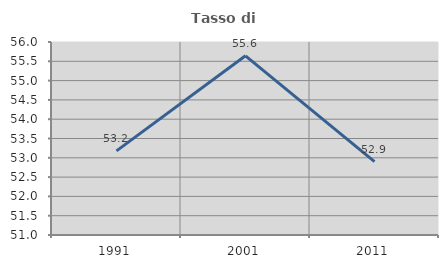
| Category | Tasso di occupazione   |
|---|---|
| 1991.0 | 53.179 |
| 2001.0 | 55.642 |
| 2011.0 | 52.901 |